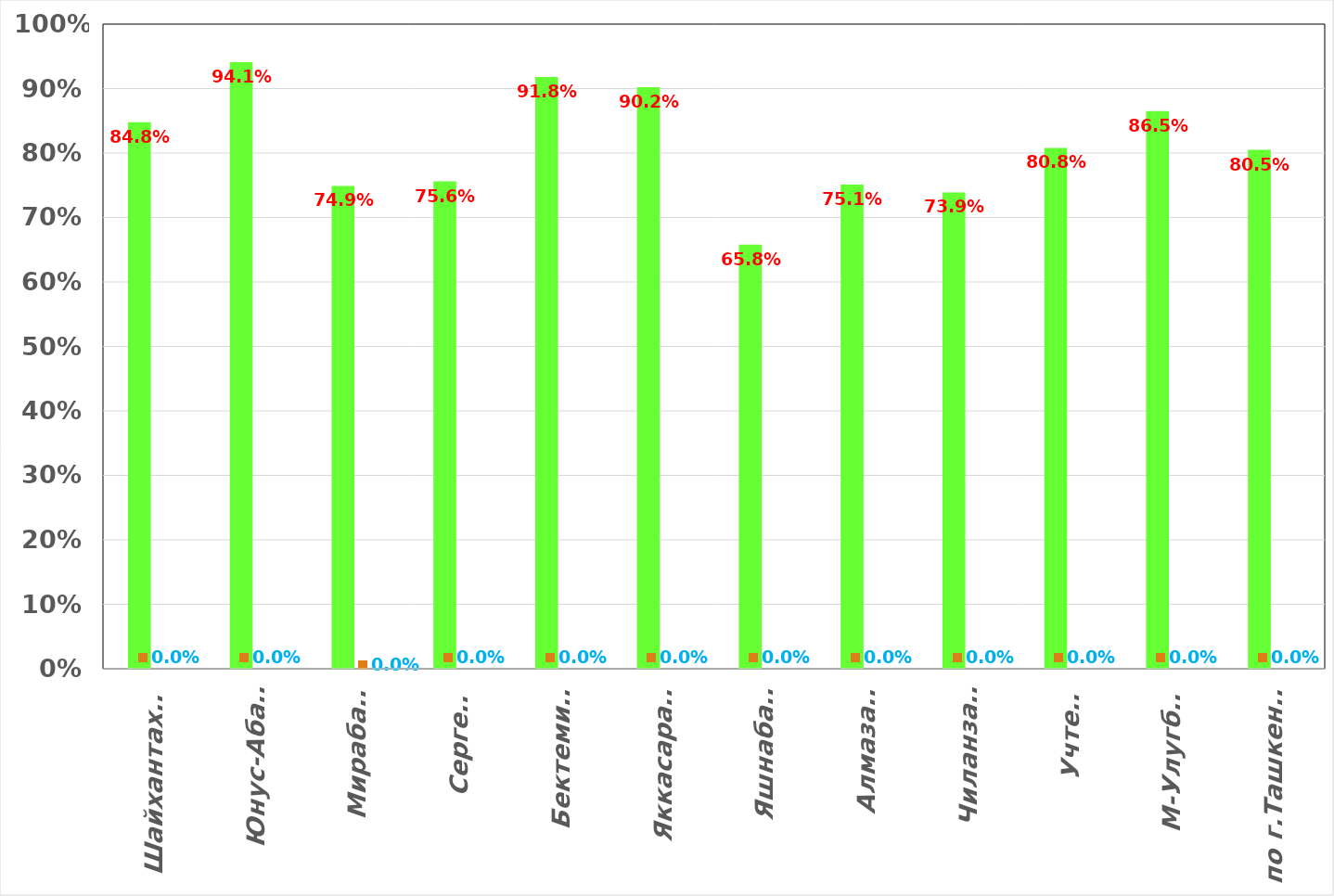
| Category | 31 дек 16 | 27 мар 23 |
|---|---|---|
| Шайхантахур  | 0.848 | 0 |
| Юнус-Абад  | 0.941 | 0 |
| Мирабад  | 0.749 | 0 |
| Сергели | 0.756 | 0 |
| Бектемир  | 0.918 | 0 |
| Яккасарай  | 0.902 | 0 |
| Яшнабад  | 0.658 | 0 |
| Алмазар  | 0.751 | 0 |
| Чиланзар  | 0.739 | 0 |
| Учтепа | 0.808 | 0 |
| М-Улугбек  | 0.865 | 0 |
| по г.Ташкенту | 0.805 | 0 |